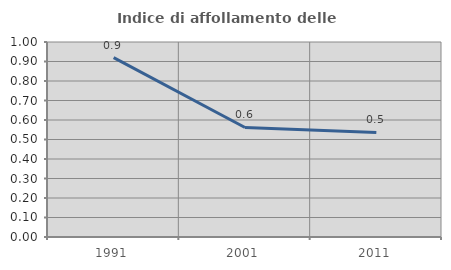
| Category | Indice di affollamento delle abitazioni  |
|---|---|
| 1991.0 | 0.92 |
| 2001.0 | 0.562 |
| 2011.0 | 0.536 |